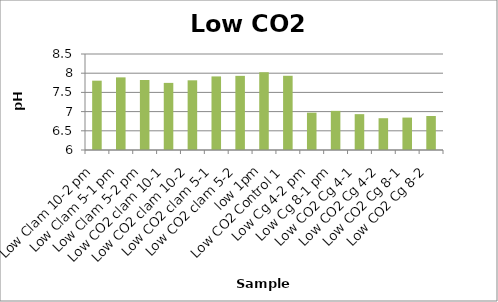
| Category | Series 0 |
|---|---|
| Low Clam 10-2 pm | 7.805 |
| Low Clam 5-1 pm | 7.891 |
| Low Clam 5-2 pm | 7.823 |
| Low CO2 clam 10-1 | 7.748 |
| Low CO2 clam 10-2 | 7.815 |
| Low CO2 clam 5-1 | 7.916 |
| Low CO2 clam 5-2 | 7.931 |
| low 1pm | 8.025 |
| Low CO2 Control 1 | 7.933 |
| Low Cg 4-2 pm | 6.972 |
| Low Cg 8-1 pm | 7.019 |
| Low CO2 Cg 4-1 | 6.934 |
| Low CO2 Cg 4-2 | 6.828 |
| Low CO2 Cg 8-1 | 6.844 |
| Low CO2 Cg 8-2 | 6.885 |